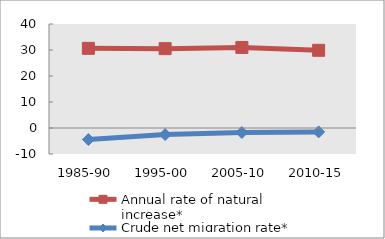
| Category | Annual rate of natural increase* | Crude net migration rate* |
|---|---|---|
| 1985-90 | 30.639 | -4.443 |
| 1995-00 | 30.52 | -2.535 |
| 2005-10 | 30.983 | -1.726 |
| 2010-15 | 29.883 | -1.495 |